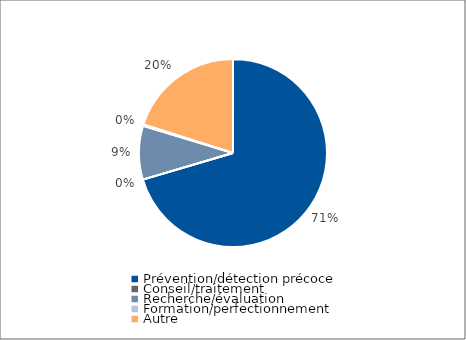
| Category | Series 0 |
|---|---|
| Prévention/détection précoce | 242322 |
| Conseil/traitement | 0 |
| Recherche/évaluation | 31788.7 |
| Formation/perfectionnement | 792 |
| Autre | 69155.09 |